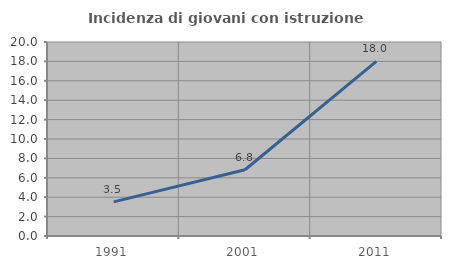
| Category | Incidenza di giovani con istruzione universitaria |
|---|---|
| 1991.0 | 3.516 |
| 2001.0 | 6.832 |
| 2011.0 | 18.004 |